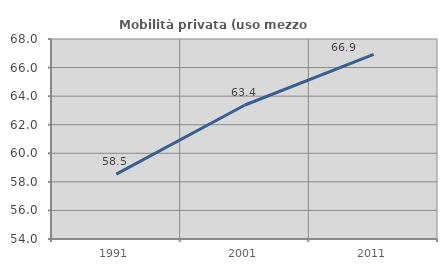
| Category | Mobilità privata (uso mezzo privato) |
|---|---|
| 1991.0 | 58.544 |
| 2001.0 | 63.38 |
| 2011.0 | 66.929 |